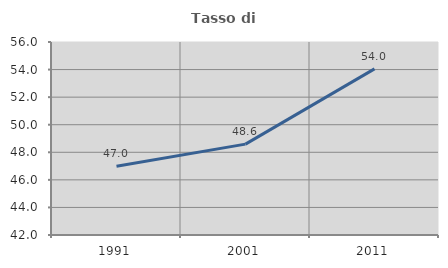
| Category | Tasso di occupazione   |
|---|---|
| 1991.0 | 46.995 |
| 2001.0 | 48.593 |
| 2011.0 | 54.048 |